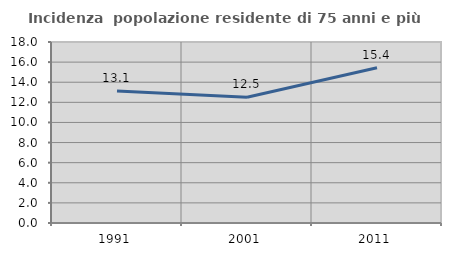
| Category | Incidenza  popolazione residente di 75 anni e più |
|---|---|
| 1991.0 | 13.128 |
| 2001.0 | 12.5 |
| 2011.0 | 15.441 |